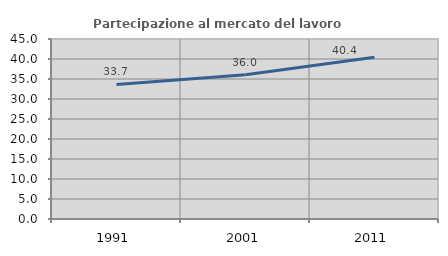
| Category | Partecipazione al mercato del lavoro  femminile |
|---|---|
| 1991.0 | 33.653 |
| 2001.0 | 36.049 |
| 2011.0 | 40.415 |